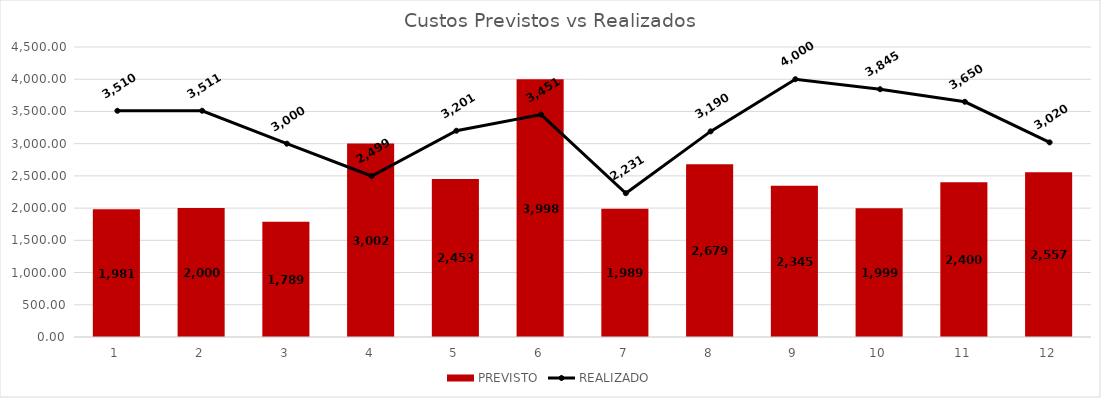
| Category | PREVISTO |
|---|---|
| 0 | 1980.5 |
| 1 | 2000.45 |
| 2 | 1789.32 |
| 3 | 3001.98 |
| 4 | 2453.2 |
| 5 | 3998 |
| 6 | 1988.76 |
| 7 | 2679 |
| 8 | 2345.2 |
| 9 | 1998.76 |
| 10 | 2400 |
| 11 | 2556.7 |